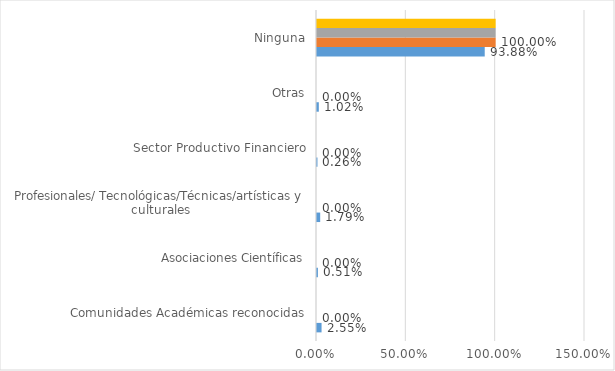
| Category | Series 0 | Series 1 | Series 2 | Series 3 |
|---|---|---|---|---|
| Comunidades Académicas reconocidas | 0.026 | 0 | 0 | 0 |
| Asociaciones Científicas | 0.005 | 0 | 0 | 0 |
| Profesionales/ Tecnológicas/Técnicas/artísticas y culturales | 0.018 | 0 | 0 | 0 |
| Sector Productivo Financiero | 0.003 | 0 | 0 | 0 |
| Otras | 0.01 | 0 | 0 | 0 |
| Ninguna | 0.939 | 1 | 1 | 1 |